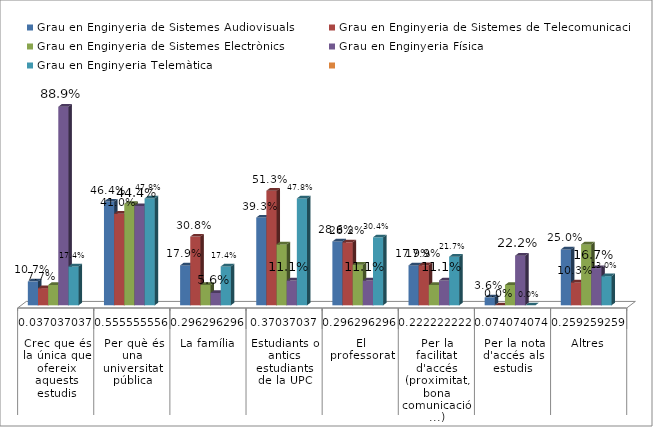
| Category | Grau en Enginyeria de Sistemes Audiovisuals | Grau en Enginyeria de Sistemes de Telecomunicació | Grau en Enginyeria de Sistemes Electrònics | Grau en Enginyeria Física | Grau en Enginyeria Telemàtica | Series 5 |
|---|---|---|---|---|---|---|
| 0 | 0.107 | 0.077 | 0.091 | 0.889 | 0.174 |  |
| 1 | 0.464 | 0.41 | 0.455 | 0.444 | 0.478 |  |
| 2 | 0.179 | 0.308 | 0.091 | 0.056 | 0.174 |  |
| 3 | 0.393 | 0.513 | 0.273 | 0.111 | 0.478 |  |
| 4 | 0.286 | 0.282 | 0.182 | 0.111 | 0.304 |  |
| 5 | 0.179 | 0.179 | 0.091 | 0.111 | 0.217 |  |
| 6 | 0.036 | 0 | 0.091 | 0.222 | 0 |  |
| 7 | 0.25 | 0.103 | 0.273 | 0.167 | 0.13 |  |